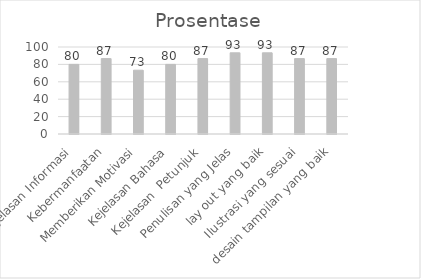
| Category | Prosentase |
|---|---|
| Kejelasan Informasi | 80 |
| Kebermanfaatan | 86.667 |
| Memberikan Motivasi | 73.333 |
| Kejelasan Bahasa | 80 |
| Kejelasan  Petunjuk | 86.667 |
| Penulisan yang Jelas | 93.333 |
| lay out yang baik | 93.333 |
| Ilustrasi yang sesuai | 86.667 |
| desain tampilan yang baik | 86.667 |